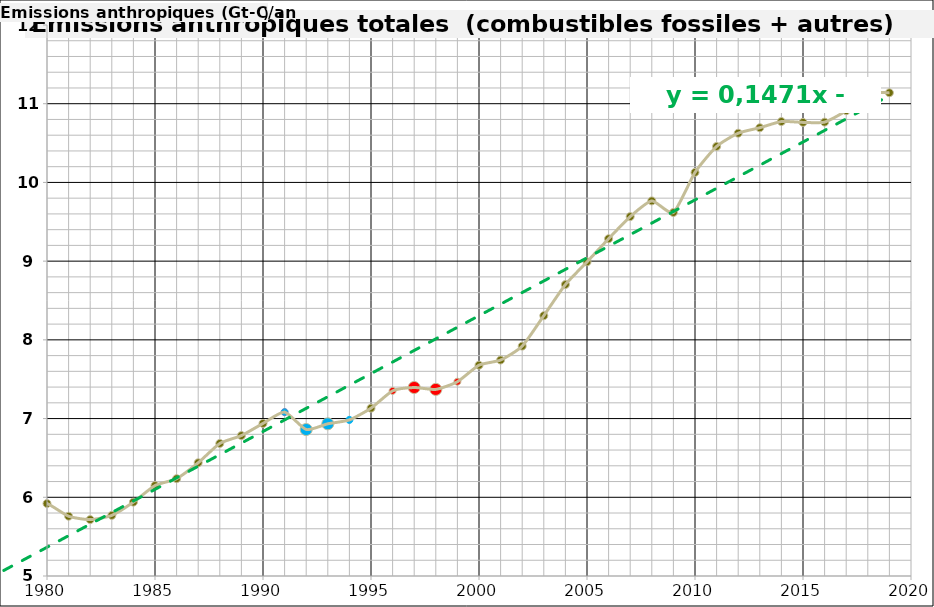
| Category | Emissions anthropiques (Gt-C/an) |
|---|---|
| 1978.0 | 5.795 |
| 1979.0 | 5.95 |
| 1980.0 | 5.921 |
| 1981.0 | 5.759 |
| 1982.0 | 5.716 |
| 1983.0 | 5.77 |
| 1984.0 | 5.938 |
| 1985.0 | 6.149 |
| 1986.0 | 6.236 |
| 1987.0 | 6.438 |
| 1988.0 | 6.684 |
| 1989.0 | 6.784 |
| 1990.0 | 6.938 |
| 1991.0 | 7.082 |
| 1992.0 | 6.861 |
| 1993.0 | 6.934 |
| 1994.0 | 6.983 |
| 1995.0 | 7.132 |
| 1996.0 | 7.352 |
| 1997.0 | 7.395 |
| 1998.0 | 7.371 |
| 1999.0 | 7.468 |
| 2000.0 | 7.678 |
| 2001.0 | 7.743 |
| 2002.0 | 7.92 |
| 2003.0 | 8.307 |
| 2004.0 | 8.703 |
| 2005.0 | 8.99 |
| 2006.0 | 9.285 |
| 2007.0 | 9.566 |
| 2008.0 | 9.765 |
| 2009.0 | 9.618 |
| 2010.0 | 10.128 |
| 2011.0 | 10.457 |
| 2012.0 | 10.625 |
| 2013.0 | 10.695 |
| 2014.0 | 10.774 |
| 2015.0 | 10.763 |
| 2016.0 | 10.766 |
| 2017.0 | 10.912 |
| 2018.0 | 11.133 |
| 2019.0 | 11.139 |